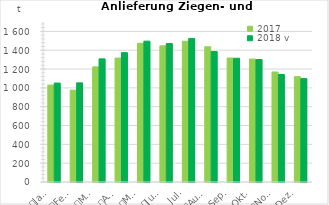
| Category | 2017 | 2018 v |
|---|---|---|
| 0 | 1029.483 | 1051.264 |
| 1 | 975.814 | 1053.339 |
| 2 | 1223.358 | 1308.333 |
| 3 | 1316.509 | 1374.435 |
| 4 | 1474.136 | 1496.7 |
| 5 | 1446.351 | 1471.407 |
| 6 | 1495.105 | 1525.771 |
| 7 | 1436.351 | 1386.114 |
| 8 | 1317.397 | 1314.921 |
| 9 | 1306.388 | 1301.35 |
| 10 | 1169.041 | 1142.218 |
| 11 | 1119.198 | 1098.517 |